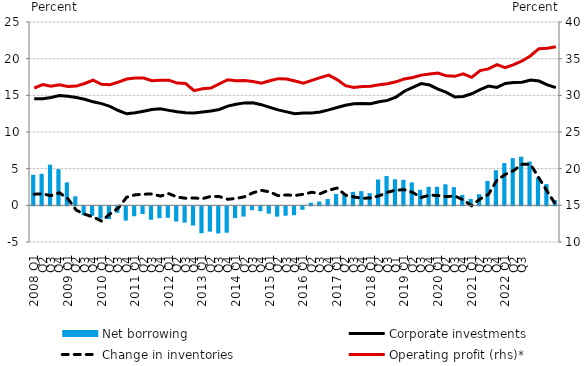
| Category | Net borrowing |
|---|---|
| 2008 Q1 | 4.156 |
| Q2 | 4.29 |
| Q3 | 5.545 |
| Q4 | 4.935 |
| 2009 Q1 | 3.13 |
| Q2 | 1.236 |
| Q3 | -1.214 |
| Q4 | -1.287 |
| 2010 Q1 | -1.668 |
| Q2 | -1.744 |
| Q3 | -0.885 |
| Q4 | -1.945 |
| 2011 Q1 | -1.349 |
| Q2 | -1.042 |
| Q3 | -1.828 |
| Q4 | -1.616 |
| 2012 Q1 | -1.564 |
| Q2 | -2.071 |
| Q3 | -2.225 |
| Q4 | -2.613 |
| 2013 Q1 | -3.675 |
| Q2 | -3.449 |
| Q3 | -3.702 |
| Q4 | -3.595 |
| 2014 Q1 | -1.61 |
| Q2 | -1.397 |
| Q3 | -0.523 |
| Q4 | -0.664 |
| 2015 Q1 | -0.997 |
| Q2 | -1.404 |
| Q3 | -1.277 |
| Q4 | -1.214 |
| 2016 Q1 | -0.473 |
| Q2 | 0.355 |
| Q3 | 0.515 |
| Q4 | 0.862 |
| 2017 Q1 | 1.554 |
| Q2 | 1.427 |
| Q3 | 1.84 |
| Q4 | 1.933 |
| 2018 Q1 | 1.663 |
| Q2 | 3.524 |
| Q3 | 3.992 |
| Q1 | 3.557 |
| 2019 Q1 | 3.48 |
| Q2 | 3.13 |
| Q3 | 2.117 |
| Q4 | 2.525 |
| 2020 Q1 | 2.53 |
| Q2 | 2.87 |
| Q3 | 2.476 |
| Q4 | 1.41 |
|  2021 Q1 | 0.871 |
| Q2 | 1.518 |
| Q3 | 3.333 |
| Q4 | 4.784 |
|  2022 Q1 | 5.759 |
| Q2 | 6.435 |
| Q3 | 6.634 |